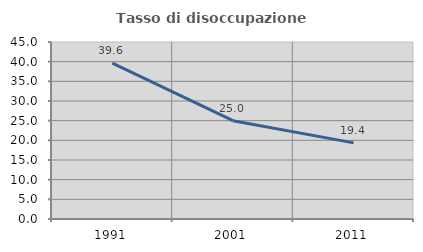
| Category | Tasso di disoccupazione giovanile  |
|---|---|
| 1991.0 | 39.623 |
| 2001.0 | 25 |
| 2011.0 | 19.355 |